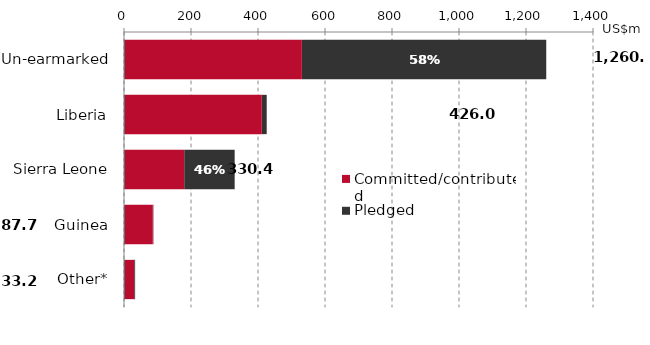
| Category | Committed/contributed | Pledged |
|---|---|---|
| Un-earmarked | 530.833 | 729.622 |
| Liberia | 411.094 | 14.934 |
| Sierra Leone | 179.864 | 150.503 |
| Guinea | 85.743 | 2 |
| Other* | 30.691 | 2.5 |